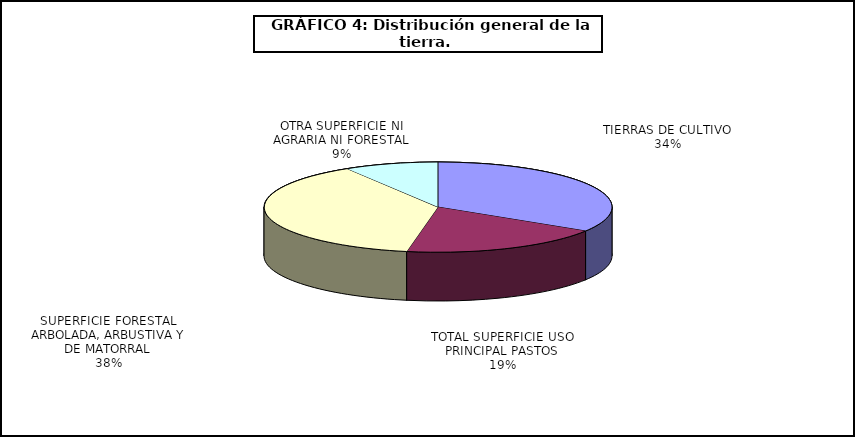
| Category | Series 0 |
|---|---|
| TIERRAS DE CULTIVO | 17132780 |
| TOTAL SUPERFICIE USO PRINCIPAL PASTOS | 9600206 |
| SUPERFICIE FORESTAL ARBOLADA, ARBUSTIVA Y DE MATORRAL | 19403790 |
| OTRA SUPERFICIE NI AGRARIA NI FORESTAL | 4417660 |